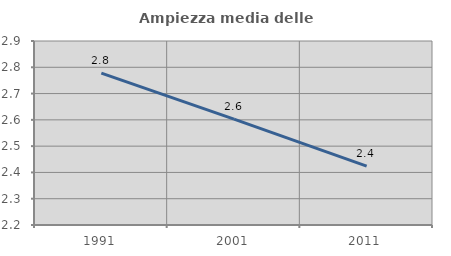
| Category | Ampiezza media delle famiglie |
|---|---|
| 1991.0 | 2.778 |
| 2001.0 | 2.603 |
| 2011.0 | 2.424 |